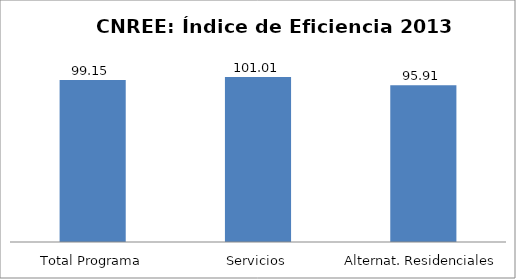
| Category | Índice de eficiencia (IE)  |
|---|---|
| Total Programa | 99.147 |
| Servicios | 101.006 |
| Alternat. Residenciales | 95.911 |